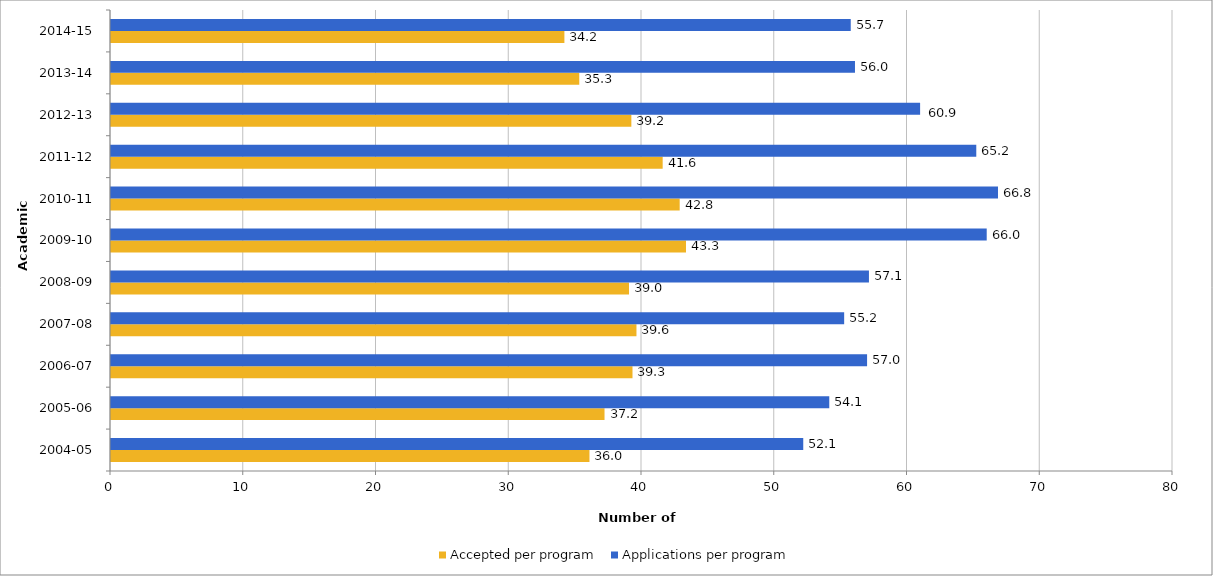
| Category | Accepted per program | Applications per program |
|---|---|---|
| 2004-05 | 36.042 | 52.147 |
| 2005-06 | 37.177 | 54.107 |
| 2006-07 | 39.284 | 56.955 |
| 2007-08 | 39.583 | 55.229 |
| 2008-09 | 39.022 | 57.096 |
| 2009-10 | 43.314 | 65.968 |
| 2010-11 | 42.839 | 66.817 |
| 2011-12 | 41.557 | 65.181 |
| 2012-13 | 39.198 | 60.95 |
| 2013-14 | 35.275 | 56.044 |
| 2014-15 | 34.154 | 55.724 |